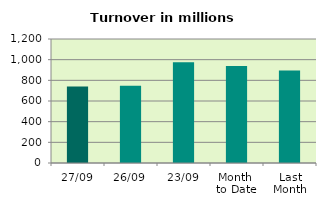
| Category | Series 0 |
|---|---|
| 27/09 | 740.872 |
| 26/09 | 747.93 |
| 23/09 | 973.989 |
| Month 
to Date | 939.728 |
| Last
Month | 893.956 |